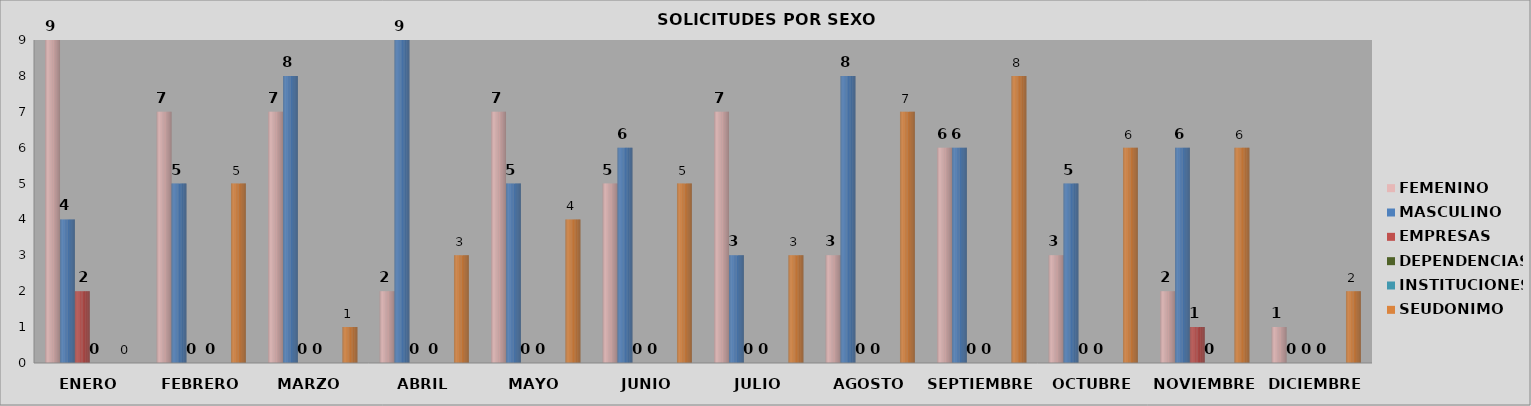
| Category | FEMENINO | MASCULINO | EMPRESAS | DEPENDENCIAS | INSTITUCIONES | SEUDONIMO |
|---|---|---|---|---|---|---|
| ENERO | 9 | 4 | 2 | 0 | 0 | 0 |
| FEBRERO | 7 | 5 | 0 | 0 | 0 | 5 |
| MARZO  | 7 | 8 | 0 | 0 | 0 | 1 |
| ABRIL | 2 | 9 | 0 | 0 | 0 | 3 |
| MAYO | 7 | 5 | 0 | 0 | 0 | 4 |
| JUNIO | 5 | 6 | 0 | 0 | 0 | 5 |
| JULIO | 7 | 3 | 0 | 0 | 0 | 3 |
| AGOSTO | 3 | 8 | 0 | 0 | 0 | 7 |
| SEPTIEMBRE | 6 | 6 | 0 | 0 | 0 | 8 |
| OCTUBRE | 3 | 5 | 0 | 0 | 0 | 6 |
| NOVIEMBRE | 2 | 6 | 1 | 0 | 0 | 6 |
| DICIEMBRE | 1 | 0 | 0 | 0 | 0 | 2 |